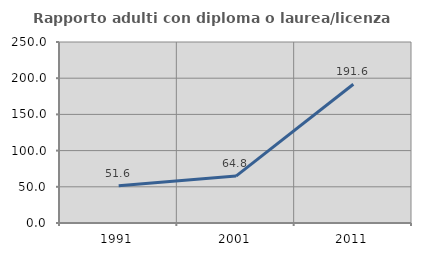
| Category | Rapporto adulti con diploma o laurea/licenza media  |
|---|---|
| 1991.0 | 51.606 |
| 2001.0 | 64.812 |
| 2011.0 | 191.647 |